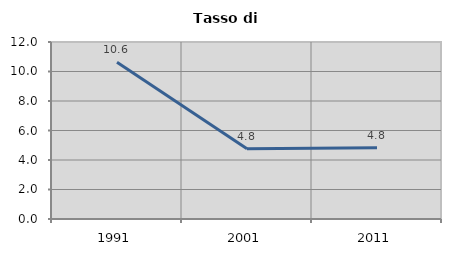
| Category | Tasso di disoccupazione   |
|---|---|
| 1991.0 | 10.63 |
| 2001.0 | 4.762 |
| 2011.0 | 4.839 |